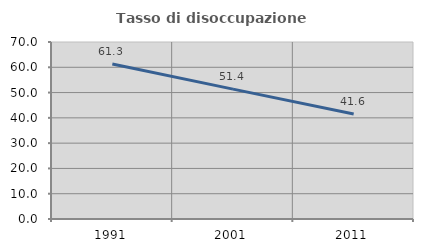
| Category | Tasso di disoccupazione giovanile  |
|---|---|
| 1991.0 | 61.298 |
| 2001.0 | 51.37 |
| 2011.0 | 41.56 |